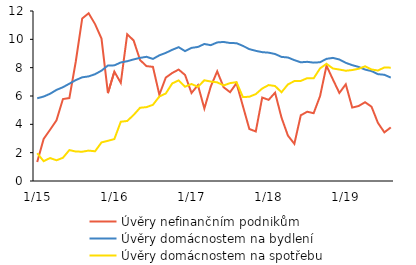
| Category | Úvěry nefinančním podnikům | Úvěry domácnostem na bydlení | Úvěry domácnostem na spotřebu |
|---|---|---|---|
|  1/15 | 1.344 | 5.84 | 1.96 |
| 2 | 2.969 | 5.96 | 1.4 |
| 3 | 3.615 | 6.159 | 1.62 |
| 4 | 4.281 | 6.43 | 1.462 |
| 5 | 5.782 | 6.62 | 1.639 |
| 6 | 5.853 | 6.869 | 2.183 |
| 7 | 8.437 | 7.124 | 2.08 |
| 8 | 11.475 | 7.318 | 2.069 |
| 9 | 11.846 | 7.384 | 2.145 |
| 10 | 11.075 | 7.54 | 2.098 |
| 11 | 10.058 | 7.79 | 2.724 |
| 12 | 6.204 | 8.153 | 2.838 |
|  1/16 | 7.719 | 8.163 | 2.96 |
| 2 | 6.928 | 8.368 | 4.184 |
| 3 | 10.362 | 8.454 | 4.237 |
| 4 | 9.918 | 8.583 | 4.663 |
| 5 | 8.537 | 8.692 | 5.171 |
| 6 | 8.109 | 8.768 | 5.214 |
| 7 | 8.057 | 8.617 | 5.377 |
| 8 | 6.09 | 8.871 | 5.965 |
| 9 | 7.299 | 9.044 | 6.179 |
| 10 | 7.625 | 9.26 | 6.887 |
| 11 | 7.866 | 9.446 | 7.103 |
| 12 | 7.485 | 9.166 | 6.655 |
|  1/17 | 6.213 | 9.397 | 6.847 |
| 1/00 | 6.765 | 9.463 | 6.648 |
| 3 | 5.115 | 9.671 | 7.111 |
| 4 | 6.673 | 9.588 | 7.018 |
| 5 | 7.74 | 9.782 | 6.965 |
| 6 | 6.618 | 9.815 | 6.745 |
| 7 | 6.269 | 9.74 | 6.909 |
| 8 | 6.902 | 9.729 | 6.978 |
| 9 | 5.281 | 9.537 | 5.921 |
| 10 | 3.669 | 9.308 | 5.949 |
| 11 | 3.496 | 9.188 | 6.133 |
| 12 | 5.891 | 9.094 | 6.528 |
|  1/18 | 5.728 | 9.059 | 6.772 |
| 2 | 6.234 | 8.964 | 6.704 |
| 3 | 4.475 | 8.76 | 6.263 |
| 4 | 3.204 | 8.718 | 6.82 |
| 5 | 2.625 | 8.532 | 7.051 |
| 6 | 4.638 | 8.379 | 7.065 |
| 7 | 4.89 | 8.413 | 7.26 |
| 8 | 4.785 | 8.355 | 7.247 |
| 9 | 5.993 | 8.384 | 7.95 |
| 10 | 8.137 | 8.622 | 8.271 |
| 11 | 7.165 | 8.691 | 7.942 |
| 12 | 6.217 | 8.578 | 7.867 |
|  1/19 | 6.825 | 8.341 | 7.783 |
| 2 | 5.184 | 8.179 | 7.832 |
| 3 | 5.293 | 8.052 | 7.921 |
| 4 | 5.561 | 7.865 | 8.096 |
| 5 | 5.245 | 7.758 | 7.872 |
| 6 | 4.106 | 7.542 | 7.8 |
| 7 | 3.433 | 7.497 | 8.014 |
| 8 | 3.782 | 7.3 | 8 |